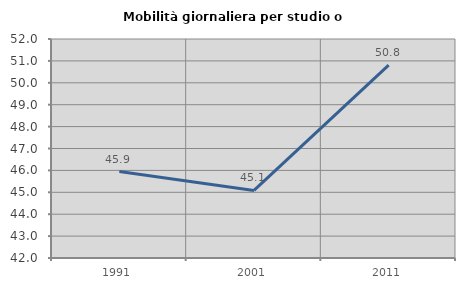
| Category | Mobilità giornaliera per studio o lavoro |
|---|---|
| 1991.0 | 45.948 |
| 2001.0 | 45.084 |
| 2011.0 | 50.808 |